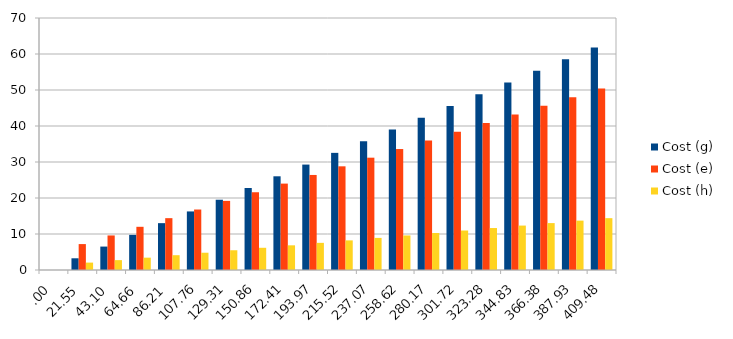
| Category | Cost (g) | Cost (e) | Cost (h) |
|---|---|---|---|
| 0 | 0 | 0 | 0 |
| 21.55 | 3.254 | 7.2 | 2.057 |
| 43.10 | 6.508 | 9.6 | 2.743 |
| 64.66 | 9.761 | 12 | 3.429 |
| 86.21 | 13.015 | 14.4 | 4.114 |
| 107.76 | 16.269 | 16.8 | 4.8 |
| 129.31 | 19.523 | 19.2 | 5.486 |
| 150.86 | 22.777 | 21.6 | 6.171 |
| 172.41 | 26.03 | 24 | 6.857 |
| 193.97 | 29.284 | 26.4 | 7.543 |
| 215.52 | 32.538 | 28.8 | 8.229 |
| 237.07 | 35.792 | 31.2 | 8.914 |
| 258.62 | 39.046 | 33.6 | 9.6 |
| 280.17 | 42.299 | 36 | 10.286 |
| 301.72 | 45.553 | 38.4 | 10.971 |
| 323.28 | 48.807 | 40.8 | 11.657 |
| 344.83 | 52.061 | 43.2 | 12.343 |
| 366.38 | 55.314 | 45.6 | 13.029 |
| 387.93 | 58.568 | 48 | 13.714 |
| 409.48 | 61.822 | 50.4 | 14.4 |